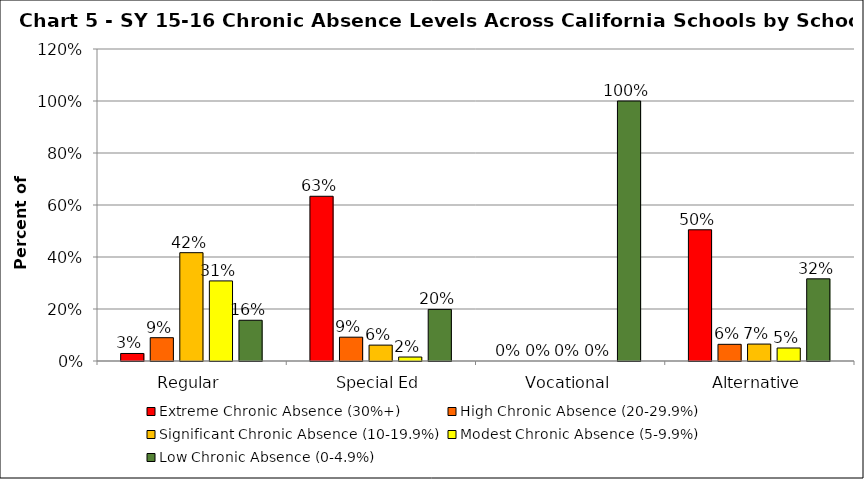
| Category | Extreme Chronic Absence (30%+) | High Chronic Absence (20-29.9%) | Significant Chronic Absence (10-19.9%) | Modest Chronic Absence (5-9.9%) | Low Chronic Absence (0-4.9%) |
|---|---|---|---|---|---|
| 0 | 0.029 | 0.09 | 0.417 | 0.308 | 0.157 |
| 1 | 0.634 | 0.092 | 0.061 | 0.015 | 0.198 |
| 2 | 0 | 0 | 0 | 0 | 1 |
| 3 | 0.505 | 0.064 | 0.065 | 0.05 | 0.316 |